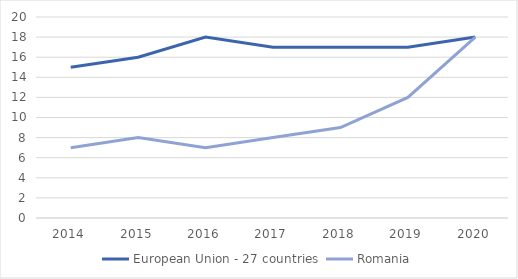
| Category | European Union - 27 countries | Romania |
|---|---|---|
| 2014 | 15 | 7 |
| 2015 | 16 | 8 |
| 2016 | 18 | 7 |
| 2017 | 17 | 8 |
| 2018 | 17 | 9 |
| 2019 | 17 | 12 |
| 2020 | 18 | 18 |